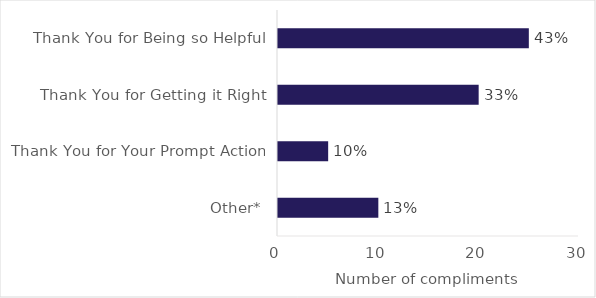
| Category | Series 0 |
|---|---|
| Other* | 10 |
| Thank You for Your Prompt Action | 5 |
| Thank You for Getting it Right | 20 |
| Thank You for Being so Helpful | 25 |